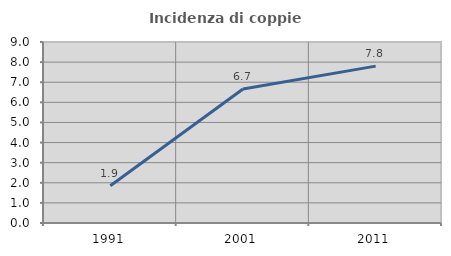
| Category | Incidenza di coppie miste |
|---|---|
| 1991.0 | 1.852 |
| 2001.0 | 6.667 |
| 2011.0 | 7.801 |